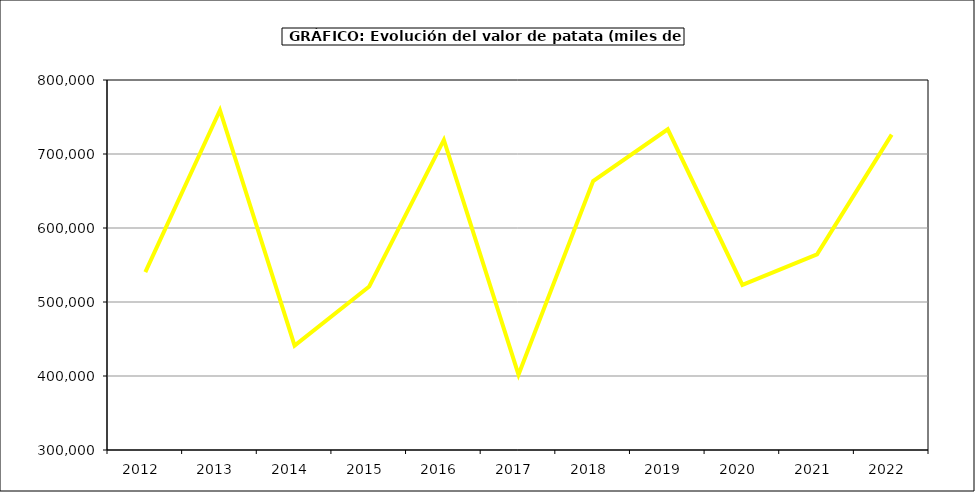
| Category | Valor |
|---|---|
| 2012.0 | 540398.006 |
| 2013.0 | 759146.328 |
| 2014.0 | 441131.161 |
| 2015.0 | 520997 |
| 2016.0 | 719010 |
| 2017.0 | 401760.918 |
| 2018.0 | 663406.797 |
| 2019.0 | 733375.272 |
| 2020.0 | 523217.415 |
| 2021.0 | 564395.947 |
| 2022.0 | 726232.928 |